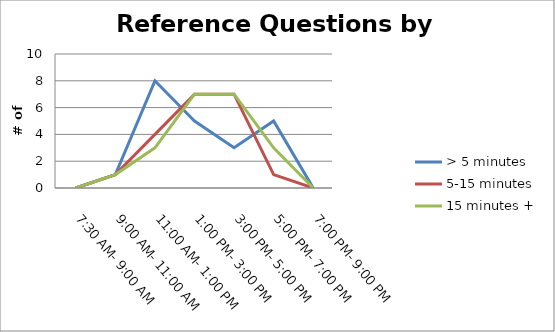
| Category | > 5 minutes | 5-15 minutes | 15 minutes + |
|---|---|---|---|
| 7:30 AM- 9:00 AM | 0 | 0 | 0 |
| 9:00 AM- 11:00 AM | 1 | 1 | 1 |
| 11:00 AM- 1:00 PM | 8 | 4 | 3 |
| 1:00 PM- 3:00 PM | 5 | 7 | 7 |
| 3:00 PM- 5:00 PM | 3 | 7 | 7 |
| 5:00 PM- 7:00 PM | 5 | 1 | 3 |
| 7:00 PM- 9:00 PM | 0 | 0 | 0 |